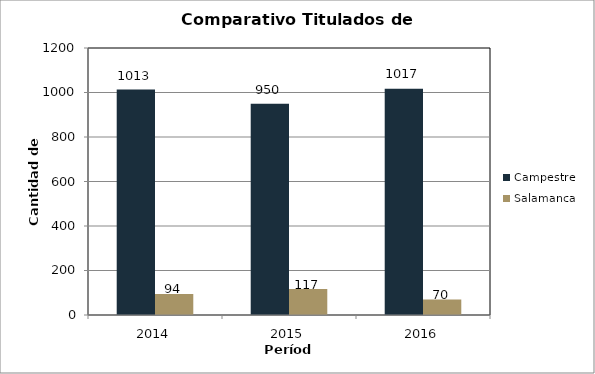
| Category | Campestre | Salamanca |
|---|---|---|
| 2014.0 | 1013 | 94 |
| 2015.0 | 950 | 117 |
| 2016.0 | 1017 | 70 |